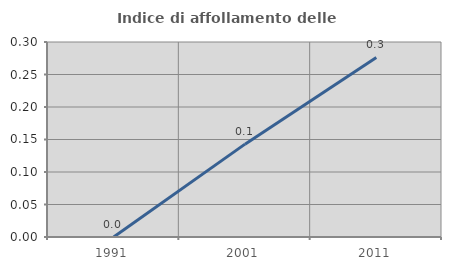
| Category | Indice di affollamento delle abitazioni  |
|---|---|
| 1991.0 | 0 |
| 2001.0 | 0.143 |
| 2011.0 | 0.276 |